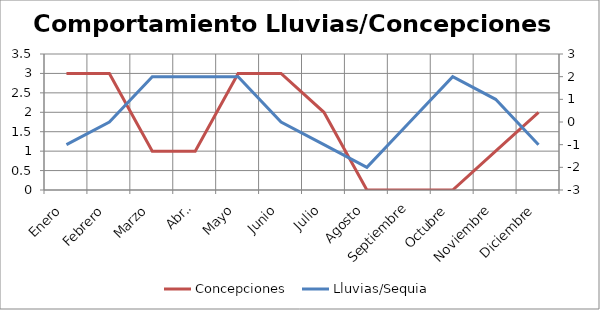
| Category | Concepciones  |
|---|---|
| Enero | 3 |
| Febrero | 3 |
| Marzo | 1 |
| Abril | 1 |
| Mayo | 3 |
| Junio | 3 |
| Julio | 2 |
| Agosto | 0 |
| Septiembre | 0 |
| Octubre | 0 |
| Noviembre | 1 |
| Diciembre | 2 |